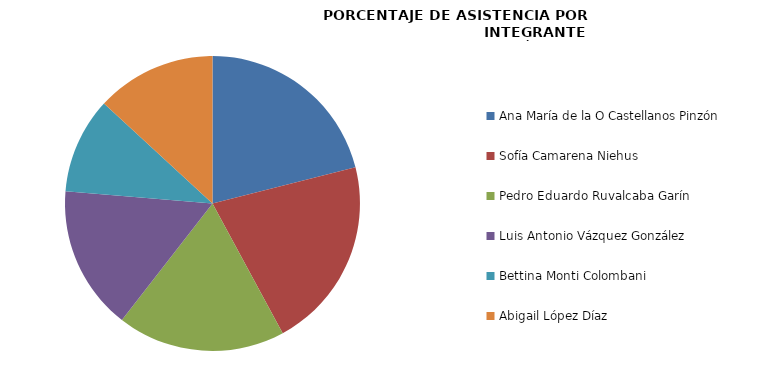
| Category | Series 0 |
|---|---|
| Ana María de la O Castellanos Pinzón | 100 |
| Sofía Camarena Niehus | 100 |
| Pedro Eduardo Ruvalcaba Garín | 87.5 |
| Luis Antonio Vázquez González | 75 |
| Bettina Monti Colombani | 50 |
| Abigail López Díaz | 62.5 |